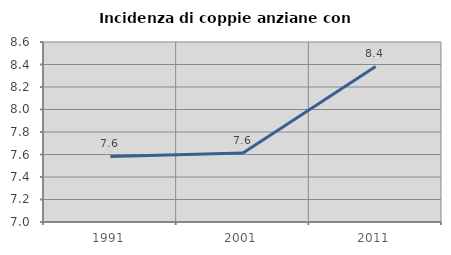
| Category | Incidenza di coppie anziane con figli |
|---|---|
| 1991.0 | 7.583 |
| 2001.0 | 7.614 |
| 2011.0 | 8.383 |